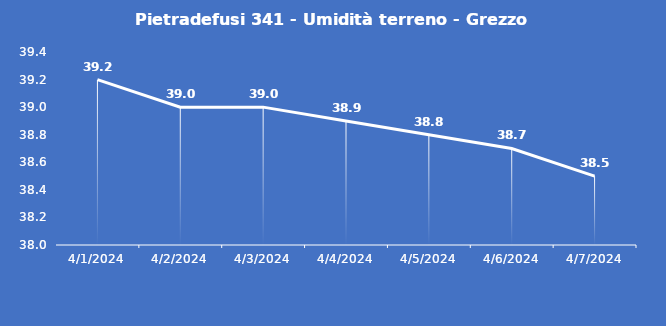
| Category | Pietradefusi 341 - Umidità terreno - Grezzo (%VWC) |
|---|---|
| 4/1/24 | 39.2 |
| 4/2/24 | 39 |
| 4/3/24 | 39 |
| 4/4/24 | 38.9 |
| 4/5/24 | 38.8 |
| 4/6/24 | 38.7 |
| 4/7/24 | 38.5 |